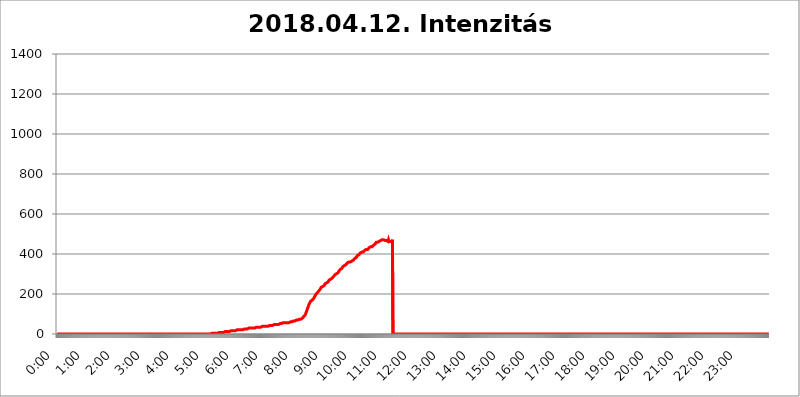
| Category | 2018.04.12. Intenzitás [W/m^2] |
|---|---|
| 0.0 | 0 |
| 0.0006944444444444445 | 0 |
| 0.001388888888888889 | 0 |
| 0.0020833333333333333 | 0 |
| 0.002777777777777778 | 0 |
| 0.003472222222222222 | 0 |
| 0.004166666666666667 | 0 |
| 0.004861111111111111 | 0 |
| 0.005555555555555556 | 0 |
| 0.0062499999999999995 | 0 |
| 0.006944444444444444 | 0 |
| 0.007638888888888889 | 0 |
| 0.008333333333333333 | 0 |
| 0.009027777777777779 | 0 |
| 0.009722222222222222 | 0 |
| 0.010416666666666666 | 0 |
| 0.011111111111111112 | 0 |
| 0.011805555555555555 | 0 |
| 0.012499999999999999 | 0 |
| 0.013194444444444444 | 0 |
| 0.013888888888888888 | 0 |
| 0.014583333333333332 | 0 |
| 0.015277777777777777 | 0 |
| 0.015972222222222224 | 0 |
| 0.016666666666666666 | 0 |
| 0.017361111111111112 | 0 |
| 0.018055555555555557 | 0 |
| 0.01875 | 0 |
| 0.019444444444444445 | 0 |
| 0.02013888888888889 | 0 |
| 0.020833333333333332 | 0 |
| 0.02152777777777778 | 0 |
| 0.022222222222222223 | 0 |
| 0.02291666666666667 | 0 |
| 0.02361111111111111 | 0 |
| 0.024305555555555556 | 0 |
| 0.024999999999999998 | 0 |
| 0.025694444444444447 | 0 |
| 0.02638888888888889 | 0 |
| 0.027083333333333334 | 0 |
| 0.027777777777777776 | 0 |
| 0.02847222222222222 | 0 |
| 0.029166666666666664 | 0 |
| 0.029861111111111113 | 0 |
| 0.030555555555555555 | 0 |
| 0.03125 | 0 |
| 0.03194444444444445 | 0 |
| 0.03263888888888889 | 0 |
| 0.03333333333333333 | 0 |
| 0.034027777777777775 | 0 |
| 0.034722222222222224 | 0 |
| 0.035416666666666666 | 0 |
| 0.036111111111111115 | 0 |
| 0.03680555555555556 | 0 |
| 0.0375 | 0 |
| 0.03819444444444444 | 0 |
| 0.03888888888888889 | 0 |
| 0.03958333333333333 | 0 |
| 0.04027777777777778 | 0 |
| 0.04097222222222222 | 0 |
| 0.041666666666666664 | 0 |
| 0.042361111111111106 | 0 |
| 0.04305555555555556 | 0 |
| 0.043750000000000004 | 0 |
| 0.044444444444444446 | 0 |
| 0.04513888888888889 | 0 |
| 0.04583333333333334 | 0 |
| 0.04652777777777778 | 0 |
| 0.04722222222222222 | 0 |
| 0.04791666666666666 | 0 |
| 0.04861111111111111 | 0 |
| 0.049305555555555554 | 0 |
| 0.049999999999999996 | 0 |
| 0.05069444444444445 | 0 |
| 0.051388888888888894 | 0 |
| 0.052083333333333336 | 0 |
| 0.05277777777777778 | 0 |
| 0.05347222222222222 | 0 |
| 0.05416666666666667 | 0 |
| 0.05486111111111111 | 0 |
| 0.05555555555555555 | 0 |
| 0.05625 | 0 |
| 0.05694444444444444 | 0 |
| 0.057638888888888885 | 0 |
| 0.05833333333333333 | 0 |
| 0.05902777777777778 | 0 |
| 0.059722222222222225 | 0 |
| 0.06041666666666667 | 0 |
| 0.061111111111111116 | 0 |
| 0.06180555555555556 | 0 |
| 0.0625 | 0 |
| 0.06319444444444444 | 0 |
| 0.06388888888888888 | 0 |
| 0.06458333333333334 | 0 |
| 0.06527777777777778 | 0 |
| 0.06597222222222222 | 0 |
| 0.06666666666666667 | 0 |
| 0.06736111111111111 | 0 |
| 0.06805555555555555 | 0 |
| 0.06874999999999999 | 0 |
| 0.06944444444444443 | 0 |
| 0.07013888888888889 | 0 |
| 0.07083333333333333 | 0 |
| 0.07152777777777779 | 0 |
| 0.07222222222222223 | 0 |
| 0.07291666666666667 | 0 |
| 0.07361111111111111 | 0 |
| 0.07430555555555556 | 0 |
| 0.075 | 0 |
| 0.07569444444444444 | 0 |
| 0.0763888888888889 | 0 |
| 0.07708333333333334 | 0 |
| 0.07777777777777778 | 0 |
| 0.07847222222222222 | 0 |
| 0.07916666666666666 | 0 |
| 0.0798611111111111 | 0 |
| 0.08055555555555556 | 0 |
| 0.08125 | 0 |
| 0.08194444444444444 | 0 |
| 0.08263888888888889 | 0 |
| 0.08333333333333333 | 0 |
| 0.08402777777777777 | 0 |
| 0.08472222222222221 | 0 |
| 0.08541666666666665 | 0 |
| 0.08611111111111112 | 0 |
| 0.08680555555555557 | 0 |
| 0.08750000000000001 | 0 |
| 0.08819444444444445 | 0 |
| 0.08888888888888889 | 0 |
| 0.08958333333333333 | 0 |
| 0.09027777777777778 | 0 |
| 0.09097222222222222 | 0 |
| 0.09166666666666667 | 0 |
| 0.09236111111111112 | 0 |
| 0.09305555555555556 | 0 |
| 0.09375 | 0 |
| 0.09444444444444444 | 0 |
| 0.09513888888888888 | 0 |
| 0.09583333333333333 | 0 |
| 0.09652777777777777 | 0 |
| 0.09722222222222222 | 0 |
| 0.09791666666666667 | 0 |
| 0.09861111111111111 | 0 |
| 0.09930555555555555 | 0 |
| 0.09999999999999999 | 0 |
| 0.10069444444444443 | 0 |
| 0.1013888888888889 | 0 |
| 0.10208333333333335 | 0 |
| 0.10277777777777779 | 0 |
| 0.10347222222222223 | 0 |
| 0.10416666666666667 | 0 |
| 0.10486111111111111 | 0 |
| 0.10555555555555556 | 0 |
| 0.10625 | 0 |
| 0.10694444444444444 | 0 |
| 0.1076388888888889 | 0 |
| 0.10833333333333334 | 0 |
| 0.10902777777777778 | 0 |
| 0.10972222222222222 | 0 |
| 0.1111111111111111 | 0 |
| 0.11180555555555556 | 0 |
| 0.11180555555555556 | 0 |
| 0.1125 | 0 |
| 0.11319444444444444 | 0 |
| 0.11388888888888889 | 0 |
| 0.11458333333333333 | 0 |
| 0.11527777777777777 | 0 |
| 0.11597222222222221 | 0 |
| 0.11666666666666665 | 0 |
| 0.1173611111111111 | 0 |
| 0.11805555555555557 | 0 |
| 0.11944444444444445 | 0 |
| 0.12013888888888889 | 0 |
| 0.12083333333333333 | 0 |
| 0.12152777777777778 | 0 |
| 0.12222222222222223 | 0 |
| 0.12291666666666667 | 0 |
| 0.12291666666666667 | 0 |
| 0.12361111111111112 | 0 |
| 0.12430555555555556 | 0 |
| 0.125 | 0 |
| 0.12569444444444444 | 0 |
| 0.12638888888888888 | 0 |
| 0.12708333333333333 | 0 |
| 0.16875 | 0 |
| 0.12847222222222224 | 0 |
| 0.12916666666666668 | 0 |
| 0.12986111111111112 | 0 |
| 0.13055555555555556 | 0 |
| 0.13125 | 0 |
| 0.13194444444444445 | 0 |
| 0.1326388888888889 | 0 |
| 0.13333333333333333 | 0 |
| 0.13402777777777777 | 0 |
| 0.13402777777777777 | 0 |
| 0.13472222222222222 | 0 |
| 0.13541666666666666 | 0 |
| 0.1361111111111111 | 0 |
| 0.13749999999999998 | 0 |
| 0.13819444444444443 | 0 |
| 0.1388888888888889 | 0 |
| 0.13958333333333334 | 0 |
| 0.14027777777777778 | 0 |
| 0.14097222222222222 | 0 |
| 0.14166666666666666 | 0 |
| 0.1423611111111111 | 0 |
| 0.14305555555555557 | 0 |
| 0.14375000000000002 | 0 |
| 0.14444444444444446 | 0 |
| 0.1451388888888889 | 0 |
| 0.1451388888888889 | 0 |
| 0.14652777777777778 | 0 |
| 0.14722222222222223 | 0 |
| 0.14791666666666667 | 0 |
| 0.1486111111111111 | 0 |
| 0.14930555555555555 | 0 |
| 0.15 | 0 |
| 0.15069444444444444 | 0 |
| 0.15138888888888888 | 0 |
| 0.15208333333333332 | 0 |
| 0.15277777777777776 | 0 |
| 0.15347222222222223 | 0 |
| 0.15416666666666667 | 0 |
| 0.15486111111111112 | 0 |
| 0.15555555555555556 | 0 |
| 0.15625 | 0 |
| 0.15694444444444444 | 0 |
| 0.15763888888888888 | 0 |
| 0.15833333333333333 | 0 |
| 0.15902777777777777 | 0 |
| 0.15972222222222224 | 0 |
| 0.16041666666666668 | 0 |
| 0.16111111111111112 | 0 |
| 0.16180555555555556 | 0 |
| 0.1625 | 0 |
| 0.16319444444444445 | 0 |
| 0.1638888888888889 | 0 |
| 0.16458333333333333 | 0 |
| 0.16527777777777777 | 0 |
| 0.16597222222222222 | 0 |
| 0.16666666666666666 | 0 |
| 0.1673611111111111 | 0 |
| 0.16805555555555554 | 0 |
| 0.16874999999999998 | 0 |
| 0.16944444444444443 | 0 |
| 0.17013888888888887 | 0 |
| 0.1708333333333333 | 0 |
| 0.17152777777777775 | 0 |
| 0.17222222222222225 | 0 |
| 0.1729166666666667 | 0 |
| 0.17361111111111113 | 0 |
| 0.17430555555555557 | 0 |
| 0.17500000000000002 | 0 |
| 0.17569444444444446 | 0 |
| 0.1763888888888889 | 0 |
| 0.17708333333333334 | 0 |
| 0.17777777777777778 | 0 |
| 0.17847222222222223 | 0 |
| 0.17916666666666667 | 0 |
| 0.1798611111111111 | 0 |
| 0.18055555555555555 | 0 |
| 0.18125 | 0 |
| 0.18194444444444444 | 0 |
| 0.1826388888888889 | 0 |
| 0.18333333333333335 | 0 |
| 0.1840277777777778 | 0 |
| 0.18472222222222223 | 0 |
| 0.18541666666666667 | 0 |
| 0.18611111111111112 | 0 |
| 0.18680555555555556 | 0 |
| 0.1875 | 0 |
| 0.18819444444444444 | 0 |
| 0.18888888888888888 | 0 |
| 0.18958333333333333 | 0 |
| 0.19027777777777777 | 0 |
| 0.1909722222222222 | 0 |
| 0.19166666666666665 | 0 |
| 0.19236111111111112 | 0 |
| 0.19305555555555554 | 0 |
| 0.19375 | 0 |
| 0.19444444444444445 | 0 |
| 0.1951388888888889 | 0 |
| 0.19583333333333333 | 0 |
| 0.19652777777777777 | 0 |
| 0.19722222222222222 | 0 |
| 0.19791666666666666 | 0 |
| 0.1986111111111111 | 0 |
| 0.19930555555555554 | 0 |
| 0.19999999999999998 | 0 |
| 0.20069444444444443 | 0 |
| 0.20138888888888887 | 0 |
| 0.2020833333333333 | 0 |
| 0.2027777777777778 | 0 |
| 0.2034722222222222 | 0 |
| 0.2041666666666667 | 0 |
| 0.20486111111111113 | 0 |
| 0.20555555555555557 | 0 |
| 0.20625000000000002 | 0 |
| 0.20694444444444446 | 0 |
| 0.2076388888888889 | 0 |
| 0.20833333333333334 | 0 |
| 0.20902777777777778 | 0 |
| 0.20972222222222223 | 0 |
| 0.21041666666666667 | 0 |
| 0.2111111111111111 | 0 |
| 0.21180555555555555 | 0 |
| 0.2125 | 0 |
| 0.21319444444444444 | 0 |
| 0.2138888888888889 | 0 |
| 0.21458333333333335 | 0 |
| 0.2152777777777778 | 0 |
| 0.21597222222222223 | 0 |
| 0.21666666666666667 | 3.525 |
| 0.21736111111111112 | 0 |
| 0.21805555555555556 | 3.525 |
| 0.21875 | 3.525 |
| 0.21944444444444444 | 3.525 |
| 0.22013888888888888 | 3.525 |
| 0.22083333333333333 | 3.525 |
| 0.22152777777777777 | 3.525 |
| 0.2222222222222222 | 3.525 |
| 0.22291666666666665 | 3.525 |
| 0.2236111111111111 | 3.525 |
| 0.22430555555555556 | 3.525 |
| 0.225 | 3.525 |
| 0.22569444444444445 | 3.525 |
| 0.2263888888888889 | 7.887 |
| 0.22708333333333333 | 7.887 |
| 0.22777777777777777 | 7.887 |
| 0.22847222222222222 | 7.887 |
| 0.22916666666666666 | 7.887 |
| 0.2298611111111111 | 7.887 |
| 0.23055555555555554 | 7.887 |
| 0.23124999999999998 | 7.887 |
| 0.23194444444444443 | 7.887 |
| 0.23263888888888887 | 7.887 |
| 0.2333333333333333 | 7.887 |
| 0.2340277777777778 | 7.887 |
| 0.2347222222222222 | 12.257 |
| 0.2354166666666667 | 12.257 |
| 0.23611111111111113 | 12.257 |
| 0.23680555555555557 | 12.257 |
| 0.23750000000000002 | 12.257 |
| 0.23819444444444446 | 12.257 |
| 0.2388888888888889 | 12.257 |
| 0.23958333333333334 | 12.257 |
| 0.24027777777777778 | 12.257 |
| 0.24097222222222223 | 12.257 |
| 0.24166666666666667 | 12.257 |
| 0.2423611111111111 | 12.257 |
| 0.24305555555555555 | 12.257 |
| 0.24375 | 16.636 |
| 0.24444444444444446 | 16.636 |
| 0.24513888888888888 | 16.636 |
| 0.24583333333333335 | 16.636 |
| 0.2465277777777778 | 16.636 |
| 0.24722222222222223 | 16.636 |
| 0.24791666666666667 | 16.636 |
| 0.24861111111111112 | 16.636 |
| 0.24930555555555556 | 16.636 |
| 0.25 | 16.636 |
| 0.25069444444444444 | 21.024 |
| 0.2513888888888889 | 21.024 |
| 0.2520833333333333 | 21.024 |
| 0.25277777777777777 | 21.024 |
| 0.2534722222222222 | 21.024 |
| 0.25416666666666665 | 21.024 |
| 0.2548611111111111 | 21.024 |
| 0.2555555555555556 | 21.024 |
| 0.25625000000000003 | 21.024 |
| 0.2569444444444445 | 21.024 |
| 0.2576388888888889 | 21.024 |
| 0.25833333333333336 | 21.024 |
| 0.2590277777777778 | 21.024 |
| 0.25972222222222224 | 21.024 |
| 0.2604166666666667 | 21.024 |
| 0.2611111111111111 | 25.419 |
| 0.26180555555555557 | 25.419 |
| 0.2625 | 25.419 |
| 0.26319444444444445 | 25.419 |
| 0.2638888888888889 | 25.419 |
| 0.26458333333333334 | 25.419 |
| 0.2652777777777778 | 25.419 |
| 0.2659722222222222 | 25.419 |
| 0.26666666666666666 | 25.419 |
| 0.2673611111111111 | 29.823 |
| 0.26805555555555555 | 25.419 |
| 0.26875 | 29.823 |
| 0.26944444444444443 | 29.823 |
| 0.2701388888888889 | 29.823 |
| 0.2708333333333333 | 29.823 |
| 0.27152777777777776 | 29.823 |
| 0.2722222222222222 | 29.823 |
| 0.27291666666666664 | 29.823 |
| 0.2736111111111111 | 29.823 |
| 0.2743055555555555 | 29.823 |
| 0.27499999999999997 | 29.823 |
| 0.27569444444444446 | 29.823 |
| 0.27638888888888885 | 29.823 |
| 0.27708333333333335 | 29.823 |
| 0.2777777777777778 | 29.823 |
| 0.27847222222222223 | 34.234 |
| 0.2791666666666667 | 34.234 |
| 0.2798611111111111 | 29.823 |
| 0.28055555555555556 | 34.234 |
| 0.28125 | 34.234 |
| 0.28194444444444444 | 34.234 |
| 0.2826388888888889 | 34.234 |
| 0.2833333333333333 | 34.234 |
| 0.28402777777777777 | 34.234 |
| 0.2847222222222222 | 34.234 |
| 0.28541666666666665 | 34.234 |
| 0.28611111111111115 | 34.234 |
| 0.28680555555555554 | 34.234 |
| 0.28750000000000003 | 38.653 |
| 0.2881944444444445 | 38.653 |
| 0.2888888888888889 | 38.653 |
| 0.28958333333333336 | 38.653 |
| 0.2902777777777778 | 38.653 |
| 0.29097222222222224 | 38.653 |
| 0.2916666666666667 | 38.653 |
| 0.2923611111111111 | 38.653 |
| 0.29305555555555557 | 38.653 |
| 0.29375 | 38.653 |
| 0.29444444444444445 | 38.653 |
| 0.2951388888888889 | 38.653 |
| 0.29583333333333334 | 38.653 |
| 0.2965277777777778 | 43.079 |
| 0.2972222222222222 | 43.079 |
| 0.29791666666666666 | 43.079 |
| 0.2986111111111111 | 43.079 |
| 0.29930555555555555 | 43.079 |
| 0.3 | 43.079 |
| 0.30069444444444443 | 43.079 |
| 0.3013888888888889 | 43.079 |
| 0.3020833333333333 | 43.079 |
| 0.30277777777777776 | 47.511 |
| 0.3034722222222222 | 47.511 |
| 0.30416666666666664 | 47.511 |
| 0.3048611111111111 | 47.511 |
| 0.3055555555555555 | 47.511 |
| 0.30624999999999997 | 47.511 |
| 0.3069444444444444 | 47.511 |
| 0.3076388888888889 | 47.511 |
| 0.30833333333333335 | 47.511 |
| 0.3090277777777778 | 47.511 |
| 0.30972222222222223 | 47.511 |
| 0.3104166666666667 | 47.511 |
| 0.3111111111111111 | 51.951 |
| 0.31180555555555556 | 51.951 |
| 0.3125 | 51.951 |
| 0.31319444444444444 | 51.951 |
| 0.3138888888888889 | 51.951 |
| 0.3145833333333333 | 51.951 |
| 0.31527777777777777 | 51.951 |
| 0.3159722222222222 | 51.951 |
| 0.31666666666666665 | 56.398 |
| 0.31736111111111115 | 56.398 |
| 0.31805555555555554 | 56.398 |
| 0.31875000000000003 | 56.398 |
| 0.3194444444444445 | 56.398 |
| 0.3201388888888889 | 56.398 |
| 0.32083333333333336 | 56.398 |
| 0.3215277777777778 | 56.398 |
| 0.32222222222222224 | 56.398 |
| 0.3229166666666667 | 56.398 |
| 0.3236111111111111 | 56.398 |
| 0.32430555555555557 | 60.85 |
| 0.325 | 56.398 |
| 0.32569444444444445 | 60.85 |
| 0.3263888888888889 | 60.85 |
| 0.32708333333333334 | 60.85 |
| 0.3277777777777778 | 60.85 |
| 0.3284722222222222 | 60.85 |
| 0.32916666666666666 | 60.85 |
| 0.3298611111111111 | 65.31 |
| 0.33055555555555555 | 65.31 |
| 0.33125 | 65.31 |
| 0.33194444444444443 | 65.31 |
| 0.3326388888888889 | 65.31 |
| 0.3333333333333333 | 65.31 |
| 0.3340277777777778 | 65.31 |
| 0.3347222222222222 | 65.31 |
| 0.3354166666666667 | 69.775 |
| 0.3361111111111111 | 69.775 |
| 0.3368055555555556 | 69.775 |
| 0.33749999999999997 | 69.775 |
| 0.33819444444444446 | 74.246 |
| 0.33888888888888885 | 74.246 |
| 0.33958333333333335 | 74.246 |
| 0.34027777777777773 | 74.246 |
| 0.34097222222222223 | 74.246 |
| 0.3416666666666666 | 74.246 |
| 0.3423611111111111 | 78.722 |
| 0.3430555555555555 | 78.722 |
| 0.34375 | 78.722 |
| 0.3444444444444445 | 83.205 |
| 0.3451388888888889 | 83.205 |
| 0.3458333333333334 | 87.692 |
| 0.34652777777777777 | 87.692 |
| 0.34722222222222227 | 92.184 |
| 0.34791666666666665 | 96.682 |
| 0.34861111111111115 | 101.184 |
| 0.34930555555555554 | 110.201 |
| 0.35000000000000003 | 114.716 |
| 0.3506944444444444 | 123.758 |
| 0.3513888888888889 | 128.284 |
| 0.3520833333333333 | 137.347 |
| 0.3527777777777778 | 146.423 |
| 0.3534722222222222 | 150.964 |
| 0.3541666666666667 | 155.509 |
| 0.3548611111111111 | 160.056 |
| 0.35555555555555557 | 164.605 |
| 0.35625 | 169.156 |
| 0.35694444444444445 | 169.156 |
| 0.3576388888888889 | 169.156 |
| 0.35833333333333334 | 173.709 |
| 0.3590277777777778 | 173.709 |
| 0.3597222222222222 | 178.264 |
| 0.36041666666666666 | 182.82 |
| 0.3611111111111111 | 187.378 |
| 0.36180555555555555 | 191.937 |
| 0.3625 | 196.497 |
| 0.36319444444444443 | 201.058 |
| 0.3638888888888889 | 201.058 |
| 0.3645833333333333 | 205.62 |
| 0.3652777777777778 | 210.182 |
| 0.3659722222222222 | 210.182 |
| 0.3666666666666667 | 214.746 |
| 0.3673611111111111 | 219.309 |
| 0.3680555555555556 | 219.309 |
| 0.36874999999999997 | 223.873 |
| 0.36944444444444446 | 228.436 |
| 0.37013888888888885 | 233 |
| 0.37083333333333335 | 233 |
| 0.37152777777777773 | 233 |
| 0.37222222222222223 | 237.564 |
| 0.3729166666666666 | 237.564 |
| 0.3736111111111111 | 242.127 |
| 0.3743055555555555 | 242.127 |
| 0.375 | 246.689 |
| 0.3756944444444445 | 251.251 |
| 0.3763888888888889 | 251.251 |
| 0.3770833333333334 | 251.251 |
| 0.37777777777777777 | 255.813 |
| 0.37847222222222227 | 255.813 |
| 0.37916666666666665 | 260.373 |
| 0.37986111111111115 | 260.373 |
| 0.38055555555555554 | 264.932 |
| 0.38125000000000003 | 269.49 |
| 0.3819444444444444 | 269.49 |
| 0.3826388888888889 | 269.49 |
| 0.3833333333333333 | 274.047 |
| 0.3840277777777778 | 274.047 |
| 0.3847222222222222 | 278.603 |
| 0.3854166666666667 | 278.603 |
| 0.3861111111111111 | 283.156 |
| 0.38680555555555557 | 283.156 |
| 0.3875 | 287.709 |
| 0.38819444444444445 | 292.259 |
| 0.3888888888888889 | 292.259 |
| 0.38958333333333334 | 296.808 |
| 0.3902777777777778 | 296.808 |
| 0.3909722222222222 | 301.354 |
| 0.39166666666666666 | 301.354 |
| 0.3923611111111111 | 305.898 |
| 0.39305555555555555 | 305.898 |
| 0.39375 | 305.898 |
| 0.39444444444444443 | 310.44 |
| 0.3951388888888889 | 314.98 |
| 0.3958333333333333 | 314.98 |
| 0.3965277777777778 | 319.517 |
| 0.3972222222222222 | 324.052 |
| 0.3979166666666667 | 324.052 |
| 0.3986111111111111 | 324.052 |
| 0.3993055555555556 | 328.584 |
| 0.39999999999999997 | 333.113 |
| 0.40069444444444446 | 337.639 |
| 0.40138888888888885 | 333.113 |
| 0.40208333333333335 | 337.639 |
| 0.40277777777777773 | 342.162 |
| 0.40347222222222223 | 342.162 |
| 0.4041666666666666 | 346.682 |
| 0.4048611111111111 | 346.682 |
| 0.4055555555555555 | 351.198 |
| 0.40625 | 351.198 |
| 0.4069444444444445 | 355.712 |
| 0.4076388888888889 | 355.712 |
| 0.4083333333333334 | 355.712 |
| 0.40902777777777777 | 360.221 |
| 0.40972222222222227 | 360.221 |
| 0.41041666666666665 | 360.221 |
| 0.41111111111111115 | 360.221 |
| 0.41180555555555554 | 364.728 |
| 0.41250000000000003 | 364.728 |
| 0.4131944444444444 | 364.728 |
| 0.4138888888888889 | 369.23 |
| 0.4145833333333333 | 369.23 |
| 0.4152777777777778 | 369.23 |
| 0.4159722222222222 | 369.23 |
| 0.4166666666666667 | 373.729 |
| 0.4173611111111111 | 378.224 |
| 0.41805555555555557 | 378.224 |
| 0.41875 | 378.224 |
| 0.41944444444444445 | 382.715 |
| 0.4201388888888889 | 387.202 |
| 0.42083333333333334 | 391.685 |
| 0.4215277777777778 | 391.685 |
| 0.4222222222222222 | 396.164 |
| 0.42291666666666666 | 396.164 |
| 0.4236111111111111 | 400.638 |
| 0.42430555555555555 | 400.638 |
| 0.425 | 405.108 |
| 0.42569444444444443 | 405.108 |
| 0.4263888888888889 | 405.108 |
| 0.4270833333333333 | 409.574 |
| 0.4277777777777778 | 409.574 |
| 0.4284722222222222 | 409.574 |
| 0.4291666666666667 | 409.574 |
| 0.4298611111111111 | 414.035 |
| 0.4305555555555556 | 414.035 |
| 0.43124999999999997 | 418.492 |
| 0.43194444444444446 | 418.492 |
| 0.43263888888888885 | 422.943 |
| 0.43333333333333335 | 422.943 |
| 0.43402777777777773 | 422.943 |
| 0.43472222222222223 | 422.943 |
| 0.4354166666666666 | 422.943 |
| 0.4361111111111111 | 427.39 |
| 0.4368055555555555 | 427.39 |
| 0.4375 | 431.833 |
| 0.4381944444444445 | 431.833 |
| 0.4388888888888889 | 431.833 |
| 0.4395833333333334 | 436.27 |
| 0.44027777777777777 | 436.27 |
| 0.44097222222222227 | 436.27 |
| 0.44166666666666665 | 436.27 |
| 0.44236111111111115 | 440.702 |
| 0.44305555555555554 | 440.702 |
| 0.44375000000000003 | 445.129 |
| 0.4444444444444444 | 445.129 |
| 0.4451388888888889 | 449.551 |
| 0.4458333333333333 | 449.551 |
| 0.4465277777777778 | 453.968 |
| 0.4472222222222222 | 458.38 |
| 0.4479166666666667 | 458.38 |
| 0.4486111111111111 | 458.38 |
| 0.44930555555555557 | 458.38 |
| 0.45 | 462.786 |
| 0.45069444444444445 | 462.786 |
| 0.4513888888888889 | 462.786 |
| 0.45208333333333334 | 462.786 |
| 0.4527777777777778 | 467.187 |
| 0.4534722222222222 | 467.187 |
| 0.45416666666666666 | 467.187 |
| 0.4548611111111111 | 471.582 |
| 0.45555555555555555 | 471.582 |
| 0.45625 | 467.187 |
| 0.45694444444444443 | 467.187 |
| 0.4576388888888889 | 471.582 |
| 0.4583333333333333 | 471.582 |
| 0.4590277777777778 | 471.582 |
| 0.4597222222222222 | 467.187 |
| 0.4604166666666667 | 471.582 |
| 0.4611111111111111 | 471.582 |
| 0.4618055555555556 | 467.187 |
| 0.46249999999999997 | 467.187 |
| 0.46319444444444446 | 467.187 |
| 0.46388888888888885 | 462.786 |
| 0.46458333333333335 | 471.582 |
| 0.46527777777777773 | 462.786 |
| 0.46597222222222223 | 462.786 |
| 0.4666666666666666 | 462.786 |
| 0.4673611111111111 | 462.786 |
| 0.4680555555555555 | 462.786 |
| 0.46875 | 467.187 |
| 0.4694444444444445 | 462.786 |
| 0.4701388888888889 | 471.582 |
| 0.4708333333333334 | 0 |
| 0.47152777777777777 | 0 |
| 0.47222222222222227 | 0 |
| 0.47291666666666665 | 0 |
| 0.47361111111111115 | 0 |
| 0.47430555555555554 | 0 |
| 0.47500000000000003 | 0 |
| 0.4756944444444444 | 0 |
| 0.4763888888888889 | 0 |
| 0.4770833333333333 | 0 |
| 0.4777777777777778 | 0 |
| 0.4784722222222222 | 0 |
| 0.4791666666666667 | 0 |
| 0.4798611111111111 | 0 |
| 0.48055555555555557 | 0 |
| 0.48125 | 0 |
| 0.48194444444444445 | 0 |
| 0.4826388888888889 | 0 |
| 0.48333333333333334 | 0 |
| 0.4840277777777778 | 0 |
| 0.4847222222222222 | 0 |
| 0.48541666666666666 | 0 |
| 0.4861111111111111 | 0 |
| 0.48680555555555555 | 0 |
| 0.4875 | 0 |
| 0.48819444444444443 | 0 |
| 0.4888888888888889 | 0 |
| 0.4895833333333333 | 0 |
| 0.4902777777777778 | 0 |
| 0.4909722222222222 | 0 |
| 0.4916666666666667 | 0 |
| 0.4923611111111111 | 0 |
| 0.4930555555555556 | 0 |
| 0.49374999999999997 | 0 |
| 0.49444444444444446 | 0 |
| 0.49513888888888885 | 0 |
| 0.49583333333333335 | 0 |
| 0.49652777777777773 | 0 |
| 0.49722222222222223 | 0 |
| 0.4979166666666666 | 0 |
| 0.4986111111111111 | 0 |
| 0.4993055555555555 | 0 |
| 0.5 | 0 |
| 0.5006944444444444 | 0 |
| 0.5013888888888889 | 0 |
| 0.5020833333333333 | 0 |
| 0.5027777777777778 | 0 |
| 0.5034722222222222 | 0 |
| 0.5041666666666667 | 0 |
| 0.5048611111111111 | 0 |
| 0.5055555555555555 | 0 |
| 0.50625 | 0 |
| 0.5069444444444444 | 0 |
| 0.5076388888888889 | 0 |
| 0.5083333333333333 | 0 |
| 0.5090277777777777 | 0 |
| 0.5097222222222222 | 0 |
| 0.5104166666666666 | 0 |
| 0.5111111111111112 | 0 |
| 0.5118055555555555 | 0 |
| 0.5125000000000001 | 0 |
| 0.5131944444444444 | 0 |
| 0.513888888888889 | 0 |
| 0.5145833333333333 | 0 |
| 0.5152777777777778 | 0 |
| 0.5159722222222222 | 0 |
| 0.5166666666666667 | 0 |
| 0.517361111111111 | 0 |
| 0.5180555555555556 | 0 |
| 0.5187499999999999 | 0 |
| 0.5194444444444445 | 0 |
| 0.5201388888888888 | 0 |
| 0.5208333333333334 | 0 |
| 0.5215277777777778 | 0 |
| 0.5222222222222223 | 0 |
| 0.5229166666666667 | 0 |
| 0.5236111111111111 | 0 |
| 0.5243055555555556 | 0 |
| 0.525 | 0 |
| 0.5256944444444445 | 0 |
| 0.5263888888888889 | 0 |
| 0.5270833333333333 | 0 |
| 0.5277777777777778 | 0 |
| 0.5284722222222222 | 0 |
| 0.5291666666666667 | 0 |
| 0.5298611111111111 | 0 |
| 0.5305555555555556 | 0 |
| 0.53125 | 0 |
| 0.5319444444444444 | 0 |
| 0.5326388888888889 | 0 |
| 0.5333333333333333 | 0 |
| 0.5340277777777778 | 0 |
| 0.5347222222222222 | 0 |
| 0.5354166666666667 | 0 |
| 0.5361111111111111 | 0 |
| 0.5368055555555555 | 0 |
| 0.5375 | 0 |
| 0.5381944444444444 | 0 |
| 0.5388888888888889 | 0 |
| 0.5395833333333333 | 0 |
| 0.5402777777777777 | 0 |
| 0.5409722222222222 | 0 |
| 0.5416666666666666 | 0 |
| 0.5423611111111112 | 0 |
| 0.5430555555555555 | 0 |
| 0.5437500000000001 | 0 |
| 0.5444444444444444 | 0 |
| 0.545138888888889 | 0 |
| 0.5458333333333333 | 0 |
| 0.5465277777777778 | 0 |
| 0.5472222222222222 | 0 |
| 0.5479166666666667 | 0 |
| 0.548611111111111 | 0 |
| 0.5493055555555556 | 0 |
| 0.5499999999999999 | 0 |
| 0.5506944444444445 | 0 |
| 0.5513888888888888 | 0 |
| 0.5520833333333334 | 0 |
| 0.5527777777777778 | 0 |
| 0.5534722222222223 | 0 |
| 0.5541666666666667 | 0 |
| 0.5548611111111111 | 0 |
| 0.5555555555555556 | 0 |
| 0.55625 | 0 |
| 0.5569444444444445 | 0 |
| 0.5576388888888889 | 0 |
| 0.5583333333333333 | 0 |
| 0.5590277777777778 | 0 |
| 0.5597222222222222 | 0 |
| 0.5604166666666667 | 0 |
| 0.5611111111111111 | 0 |
| 0.5618055555555556 | 0 |
| 0.5625 | 0 |
| 0.5631944444444444 | 0 |
| 0.5638888888888889 | 0 |
| 0.5645833333333333 | 0 |
| 0.5652777777777778 | 0 |
| 0.5659722222222222 | 0 |
| 0.5666666666666667 | 0 |
| 0.5673611111111111 | 0 |
| 0.5680555555555555 | 0 |
| 0.56875 | 0 |
| 0.5694444444444444 | 0 |
| 0.5701388888888889 | 0 |
| 0.5708333333333333 | 0 |
| 0.5715277777777777 | 0 |
| 0.5722222222222222 | 0 |
| 0.5729166666666666 | 0 |
| 0.5736111111111112 | 0 |
| 0.5743055555555555 | 0 |
| 0.5750000000000001 | 0 |
| 0.5756944444444444 | 0 |
| 0.576388888888889 | 0 |
| 0.5770833333333333 | 0 |
| 0.5777777777777778 | 0 |
| 0.5784722222222222 | 0 |
| 0.5791666666666667 | 0 |
| 0.579861111111111 | 0 |
| 0.5805555555555556 | 0 |
| 0.5812499999999999 | 0 |
| 0.5819444444444445 | 0 |
| 0.5826388888888888 | 0 |
| 0.5833333333333334 | 0 |
| 0.5840277777777778 | 0 |
| 0.5847222222222223 | 0 |
| 0.5854166666666667 | 0 |
| 0.5861111111111111 | 0 |
| 0.5868055555555556 | 0 |
| 0.5875 | 0 |
| 0.5881944444444445 | 0 |
| 0.5888888888888889 | 0 |
| 0.5895833333333333 | 0 |
| 0.5902777777777778 | 0 |
| 0.5909722222222222 | 0 |
| 0.5916666666666667 | 0 |
| 0.5923611111111111 | 0 |
| 0.5930555555555556 | 0 |
| 0.59375 | 0 |
| 0.5944444444444444 | 0 |
| 0.5951388888888889 | 0 |
| 0.5958333333333333 | 0 |
| 0.5965277777777778 | 0 |
| 0.5972222222222222 | 0 |
| 0.5979166666666667 | 0 |
| 0.5986111111111111 | 0 |
| 0.5993055555555555 | 0 |
| 0.6 | 0 |
| 0.6006944444444444 | 0 |
| 0.6013888888888889 | 0 |
| 0.6020833333333333 | 0 |
| 0.6027777777777777 | 0 |
| 0.6034722222222222 | 0 |
| 0.6041666666666666 | 0 |
| 0.6048611111111112 | 0 |
| 0.6055555555555555 | 0 |
| 0.6062500000000001 | 0 |
| 0.6069444444444444 | 0 |
| 0.607638888888889 | 0 |
| 0.6083333333333333 | 0 |
| 0.6090277777777778 | 0 |
| 0.6097222222222222 | 0 |
| 0.6104166666666667 | 0 |
| 0.611111111111111 | 0 |
| 0.6118055555555556 | 0 |
| 0.6124999999999999 | 0 |
| 0.6131944444444445 | 0 |
| 0.6138888888888888 | 0 |
| 0.6145833333333334 | 0 |
| 0.6152777777777778 | 0 |
| 0.6159722222222223 | 0 |
| 0.6166666666666667 | 0 |
| 0.6173611111111111 | 0 |
| 0.6180555555555556 | 0 |
| 0.61875 | 0 |
| 0.6194444444444445 | 0 |
| 0.6201388888888889 | 0 |
| 0.6208333333333333 | 0 |
| 0.6215277777777778 | 0 |
| 0.6222222222222222 | 0 |
| 0.6229166666666667 | 0 |
| 0.6236111111111111 | 0 |
| 0.6243055555555556 | 0 |
| 0.625 | 0 |
| 0.6256944444444444 | 0 |
| 0.6263888888888889 | 0 |
| 0.6270833333333333 | 0 |
| 0.6277777777777778 | 0 |
| 0.6284722222222222 | 0 |
| 0.6291666666666667 | 0 |
| 0.6298611111111111 | 0 |
| 0.6305555555555555 | 0 |
| 0.63125 | 0 |
| 0.6319444444444444 | 0 |
| 0.6326388888888889 | 0 |
| 0.6333333333333333 | 0 |
| 0.6340277777777777 | 0 |
| 0.6347222222222222 | 0 |
| 0.6354166666666666 | 0 |
| 0.6361111111111112 | 0 |
| 0.6368055555555555 | 0 |
| 0.6375000000000001 | 0 |
| 0.6381944444444444 | 0 |
| 0.638888888888889 | 0 |
| 0.6395833333333333 | 0 |
| 0.6402777777777778 | 0 |
| 0.6409722222222222 | 0 |
| 0.6416666666666667 | 0 |
| 0.642361111111111 | 0 |
| 0.6430555555555556 | 0 |
| 0.6437499999999999 | 0 |
| 0.6444444444444445 | 0 |
| 0.6451388888888888 | 0 |
| 0.6458333333333334 | 0 |
| 0.6465277777777778 | 0 |
| 0.6472222222222223 | 0 |
| 0.6479166666666667 | 0 |
| 0.6486111111111111 | 0 |
| 0.6493055555555556 | 0 |
| 0.65 | 0 |
| 0.6506944444444445 | 0 |
| 0.6513888888888889 | 0 |
| 0.6520833333333333 | 0 |
| 0.6527777777777778 | 0 |
| 0.6534722222222222 | 0 |
| 0.6541666666666667 | 0 |
| 0.6548611111111111 | 0 |
| 0.6555555555555556 | 0 |
| 0.65625 | 0 |
| 0.6569444444444444 | 0 |
| 0.6576388888888889 | 0 |
| 0.6583333333333333 | 0 |
| 0.6590277777777778 | 0 |
| 0.6597222222222222 | 0 |
| 0.6604166666666667 | 0 |
| 0.6611111111111111 | 0 |
| 0.6618055555555555 | 0 |
| 0.6625 | 0 |
| 0.6631944444444444 | 0 |
| 0.6638888888888889 | 0 |
| 0.6645833333333333 | 0 |
| 0.6652777777777777 | 0 |
| 0.6659722222222222 | 0 |
| 0.6666666666666666 | 0 |
| 0.6673611111111111 | 0 |
| 0.6680555555555556 | 0 |
| 0.6687500000000001 | 0 |
| 0.6694444444444444 | 0 |
| 0.6701388888888888 | 0 |
| 0.6708333333333334 | 0 |
| 0.6715277777777778 | 0 |
| 0.6722222222222222 | 0 |
| 0.6729166666666666 | 0 |
| 0.6736111111111112 | 0 |
| 0.6743055555555556 | 0 |
| 0.6749999999999999 | 0 |
| 0.6756944444444444 | 0 |
| 0.6763888888888889 | 0 |
| 0.6770833333333334 | 0 |
| 0.6777777777777777 | 0 |
| 0.6784722222222223 | 0 |
| 0.6791666666666667 | 0 |
| 0.6798611111111111 | 0 |
| 0.6805555555555555 | 0 |
| 0.68125 | 0 |
| 0.6819444444444445 | 0 |
| 0.6826388888888889 | 0 |
| 0.6833333333333332 | 0 |
| 0.6840277777777778 | 0 |
| 0.6847222222222222 | 0 |
| 0.6854166666666667 | 0 |
| 0.686111111111111 | 0 |
| 0.6868055555555556 | 0 |
| 0.6875 | 0 |
| 0.6881944444444444 | 0 |
| 0.688888888888889 | 0 |
| 0.6895833333333333 | 0 |
| 0.6902777777777778 | 0 |
| 0.6909722222222222 | 0 |
| 0.6916666666666668 | 0 |
| 0.6923611111111111 | 0 |
| 0.6930555555555555 | 0 |
| 0.69375 | 0 |
| 0.6944444444444445 | 0 |
| 0.6951388888888889 | 0 |
| 0.6958333333333333 | 0 |
| 0.6965277777777777 | 0 |
| 0.6972222222222223 | 0 |
| 0.6979166666666666 | 0 |
| 0.6986111111111111 | 0 |
| 0.6993055555555556 | 0 |
| 0.7000000000000001 | 0 |
| 0.7006944444444444 | 0 |
| 0.7013888888888888 | 0 |
| 0.7020833333333334 | 0 |
| 0.7027777777777778 | 0 |
| 0.7034722222222222 | 0 |
| 0.7041666666666666 | 0 |
| 0.7048611111111112 | 0 |
| 0.7055555555555556 | 0 |
| 0.7062499999999999 | 0 |
| 0.7069444444444444 | 0 |
| 0.7076388888888889 | 0 |
| 0.7083333333333334 | 0 |
| 0.7090277777777777 | 0 |
| 0.7097222222222223 | 0 |
| 0.7104166666666667 | 0 |
| 0.7111111111111111 | 0 |
| 0.7118055555555555 | 0 |
| 0.7125 | 0 |
| 0.7131944444444445 | 0 |
| 0.7138888888888889 | 0 |
| 0.7145833333333332 | 0 |
| 0.7152777777777778 | 0 |
| 0.7159722222222222 | 0 |
| 0.7166666666666667 | 0 |
| 0.717361111111111 | 0 |
| 0.7180555555555556 | 0 |
| 0.71875 | 0 |
| 0.7194444444444444 | 0 |
| 0.720138888888889 | 0 |
| 0.7208333333333333 | 0 |
| 0.7215277777777778 | 0 |
| 0.7222222222222222 | 0 |
| 0.7229166666666668 | 0 |
| 0.7236111111111111 | 0 |
| 0.7243055555555555 | 0 |
| 0.725 | 0 |
| 0.7256944444444445 | 0 |
| 0.7263888888888889 | 0 |
| 0.7270833333333333 | 0 |
| 0.7277777777777777 | 0 |
| 0.7284722222222223 | 0 |
| 0.7291666666666666 | 0 |
| 0.7298611111111111 | 0 |
| 0.7305555555555556 | 0 |
| 0.7312500000000001 | 0 |
| 0.7319444444444444 | 0 |
| 0.7326388888888888 | 0 |
| 0.7333333333333334 | 0 |
| 0.7340277777777778 | 0 |
| 0.7347222222222222 | 0 |
| 0.7354166666666666 | 0 |
| 0.7361111111111112 | 0 |
| 0.7368055555555556 | 0 |
| 0.7374999999999999 | 0 |
| 0.7381944444444444 | 0 |
| 0.7388888888888889 | 0 |
| 0.7395833333333334 | 0 |
| 0.7402777777777777 | 0 |
| 0.7409722222222223 | 0 |
| 0.7416666666666667 | 0 |
| 0.7423611111111111 | 0 |
| 0.7430555555555555 | 0 |
| 0.74375 | 0 |
| 0.7444444444444445 | 0 |
| 0.7451388888888889 | 0 |
| 0.7458333333333332 | 0 |
| 0.7465277777777778 | 0 |
| 0.7472222222222222 | 0 |
| 0.7479166666666667 | 0 |
| 0.748611111111111 | 0 |
| 0.7493055555555556 | 0 |
| 0.75 | 0 |
| 0.7506944444444444 | 0 |
| 0.751388888888889 | 0 |
| 0.7520833333333333 | 0 |
| 0.7527777777777778 | 0 |
| 0.7534722222222222 | 0 |
| 0.7541666666666668 | 0 |
| 0.7548611111111111 | 0 |
| 0.7555555555555555 | 0 |
| 0.75625 | 0 |
| 0.7569444444444445 | 0 |
| 0.7576388888888889 | 0 |
| 0.7583333333333333 | 0 |
| 0.7590277777777777 | 0 |
| 0.7597222222222223 | 0 |
| 0.7604166666666666 | 0 |
| 0.7611111111111111 | 0 |
| 0.7618055555555556 | 0 |
| 0.7625000000000001 | 0 |
| 0.7631944444444444 | 0 |
| 0.7638888888888888 | 0 |
| 0.7645833333333334 | 0 |
| 0.7652777777777778 | 0 |
| 0.7659722222222222 | 0 |
| 0.7666666666666666 | 0 |
| 0.7673611111111112 | 0 |
| 0.7680555555555556 | 0 |
| 0.7687499999999999 | 0 |
| 0.7694444444444444 | 0 |
| 0.7701388888888889 | 0 |
| 0.7708333333333334 | 0 |
| 0.7715277777777777 | 0 |
| 0.7722222222222223 | 0 |
| 0.7729166666666667 | 0 |
| 0.7736111111111111 | 0 |
| 0.7743055555555555 | 0 |
| 0.775 | 0 |
| 0.7756944444444445 | 0 |
| 0.7763888888888889 | 0 |
| 0.7770833333333332 | 0 |
| 0.7777777777777778 | 0 |
| 0.7784722222222222 | 0 |
| 0.7791666666666667 | 0 |
| 0.779861111111111 | 0 |
| 0.7805555555555556 | 0 |
| 0.78125 | 0 |
| 0.7819444444444444 | 0 |
| 0.782638888888889 | 0 |
| 0.7833333333333333 | 0 |
| 0.7840277777777778 | 0 |
| 0.7847222222222222 | 0 |
| 0.7854166666666668 | 0 |
| 0.7861111111111111 | 0 |
| 0.7868055555555555 | 0 |
| 0.7875 | 0 |
| 0.7881944444444445 | 0 |
| 0.7888888888888889 | 0 |
| 0.7895833333333333 | 0 |
| 0.7902777777777777 | 0 |
| 0.7909722222222223 | 0 |
| 0.7916666666666666 | 0 |
| 0.7923611111111111 | 0 |
| 0.7930555555555556 | 0 |
| 0.7937500000000001 | 0 |
| 0.7944444444444444 | 0 |
| 0.7951388888888888 | 0 |
| 0.7958333333333334 | 0 |
| 0.7965277777777778 | 0 |
| 0.7972222222222222 | 0 |
| 0.7979166666666666 | 0 |
| 0.7986111111111112 | 0 |
| 0.7993055555555556 | 0 |
| 0.7999999999999999 | 0 |
| 0.8006944444444444 | 0 |
| 0.8013888888888889 | 0 |
| 0.8020833333333334 | 0 |
| 0.8027777777777777 | 0 |
| 0.8034722222222223 | 0 |
| 0.8041666666666667 | 0 |
| 0.8048611111111111 | 0 |
| 0.8055555555555555 | 0 |
| 0.80625 | 0 |
| 0.8069444444444445 | 0 |
| 0.8076388888888889 | 0 |
| 0.8083333333333332 | 0 |
| 0.8090277777777778 | 0 |
| 0.8097222222222222 | 0 |
| 0.8104166666666667 | 0 |
| 0.811111111111111 | 0 |
| 0.8118055555555556 | 0 |
| 0.8125 | 0 |
| 0.8131944444444444 | 0 |
| 0.813888888888889 | 0 |
| 0.8145833333333333 | 0 |
| 0.8152777777777778 | 0 |
| 0.8159722222222222 | 0 |
| 0.8166666666666668 | 0 |
| 0.8173611111111111 | 0 |
| 0.8180555555555555 | 0 |
| 0.81875 | 0 |
| 0.8194444444444445 | 0 |
| 0.8201388888888889 | 0 |
| 0.8208333333333333 | 0 |
| 0.8215277777777777 | 0 |
| 0.8222222222222223 | 0 |
| 0.8229166666666666 | 0 |
| 0.8236111111111111 | 0 |
| 0.8243055555555556 | 0 |
| 0.8250000000000001 | 0 |
| 0.8256944444444444 | 0 |
| 0.8263888888888888 | 0 |
| 0.8270833333333334 | 0 |
| 0.8277777777777778 | 0 |
| 0.8284722222222222 | 0 |
| 0.8291666666666666 | 0 |
| 0.8298611111111112 | 0 |
| 0.8305555555555556 | 0 |
| 0.8312499999999999 | 0 |
| 0.8319444444444444 | 0 |
| 0.8326388888888889 | 0 |
| 0.8333333333333334 | 0 |
| 0.8340277777777777 | 0 |
| 0.8347222222222223 | 0 |
| 0.8354166666666667 | 0 |
| 0.8361111111111111 | 0 |
| 0.8368055555555555 | 0 |
| 0.8375 | 0 |
| 0.8381944444444445 | 0 |
| 0.8388888888888889 | 0 |
| 0.8395833333333332 | 0 |
| 0.8402777777777778 | 0 |
| 0.8409722222222222 | 0 |
| 0.8416666666666667 | 0 |
| 0.842361111111111 | 0 |
| 0.8430555555555556 | 0 |
| 0.84375 | 0 |
| 0.8444444444444444 | 0 |
| 0.845138888888889 | 0 |
| 0.8458333333333333 | 0 |
| 0.8465277777777778 | 0 |
| 0.8472222222222222 | 0 |
| 0.8479166666666668 | 0 |
| 0.8486111111111111 | 0 |
| 0.8493055555555555 | 0 |
| 0.85 | 0 |
| 0.8506944444444445 | 0 |
| 0.8513888888888889 | 0 |
| 0.8520833333333333 | 0 |
| 0.8527777777777777 | 0 |
| 0.8534722222222223 | 0 |
| 0.8541666666666666 | 0 |
| 0.8548611111111111 | 0 |
| 0.8555555555555556 | 0 |
| 0.8562500000000001 | 0 |
| 0.8569444444444444 | 0 |
| 0.8576388888888888 | 0 |
| 0.8583333333333334 | 0 |
| 0.8590277777777778 | 0 |
| 0.8597222222222222 | 0 |
| 0.8604166666666666 | 0 |
| 0.8611111111111112 | 0 |
| 0.8618055555555556 | 0 |
| 0.8624999999999999 | 0 |
| 0.8631944444444444 | 0 |
| 0.8638888888888889 | 0 |
| 0.8645833333333334 | 0 |
| 0.8652777777777777 | 0 |
| 0.8659722222222223 | 0 |
| 0.8666666666666667 | 0 |
| 0.8673611111111111 | 0 |
| 0.8680555555555555 | 0 |
| 0.86875 | 0 |
| 0.8694444444444445 | 0 |
| 0.8701388888888889 | 0 |
| 0.8708333333333332 | 0 |
| 0.8715277777777778 | 0 |
| 0.8722222222222222 | 0 |
| 0.8729166666666667 | 0 |
| 0.873611111111111 | 0 |
| 0.8743055555555556 | 0 |
| 0.875 | 0 |
| 0.8756944444444444 | 0 |
| 0.876388888888889 | 0 |
| 0.8770833333333333 | 0 |
| 0.8777777777777778 | 0 |
| 0.8784722222222222 | 0 |
| 0.8791666666666668 | 0 |
| 0.8798611111111111 | 0 |
| 0.8805555555555555 | 0 |
| 0.88125 | 0 |
| 0.8819444444444445 | 0 |
| 0.8826388888888889 | 0 |
| 0.8833333333333333 | 0 |
| 0.8840277777777777 | 0 |
| 0.8847222222222223 | 0 |
| 0.8854166666666666 | 0 |
| 0.8861111111111111 | 0 |
| 0.8868055555555556 | 0 |
| 0.8875000000000001 | 0 |
| 0.8881944444444444 | 0 |
| 0.8888888888888888 | 0 |
| 0.8895833333333334 | 0 |
| 0.8902777777777778 | 0 |
| 0.8909722222222222 | 0 |
| 0.8916666666666666 | 0 |
| 0.8923611111111112 | 0 |
| 0.8930555555555556 | 0 |
| 0.8937499999999999 | 0 |
| 0.8944444444444444 | 0 |
| 0.8951388888888889 | 0 |
| 0.8958333333333334 | 0 |
| 0.8965277777777777 | 0 |
| 0.8972222222222223 | 0 |
| 0.8979166666666667 | 0 |
| 0.8986111111111111 | 0 |
| 0.8993055555555555 | 0 |
| 0.9 | 0 |
| 0.9006944444444445 | 0 |
| 0.9013888888888889 | 0 |
| 0.9020833333333332 | 0 |
| 0.9027777777777778 | 0 |
| 0.9034722222222222 | 0 |
| 0.9041666666666667 | 0 |
| 0.904861111111111 | 0 |
| 0.9055555555555556 | 0 |
| 0.90625 | 0 |
| 0.9069444444444444 | 0 |
| 0.907638888888889 | 0 |
| 0.9083333333333333 | 0 |
| 0.9090277777777778 | 0 |
| 0.9097222222222222 | 0 |
| 0.9104166666666668 | 0 |
| 0.9111111111111111 | 0 |
| 0.9118055555555555 | 0 |
| 0.9125 | 0 |
| 0.9131944444444445 | 0 |
| 0.9138888888888889 | 0 |
| 0.9145833333333333 | 0 |
| 0.9152777777777777 | 0 |
| 0.9159722222222223 | 0 |
| 0.9166666666666666 | 0 |
| 0.9173611111111111 | 0 |
| 0.9180555555555556 | 0 |
| 0.9187500000000001 | 0 |
| 0.9194444444444444 | 0 |
| 0.9201388888888888 | 0 |
| 0.9208333333333334 | 0 |
| 0.9215277777777778 | 0 |
| 0.9222222222222222 | 0 |
| 0.9229166666666666 | 0 |
| 0.9236111111111112 | 0 |
| 0.9243055555555556 | 0 |
| 0.9249999999999999 | 0 |
| 0.9256944444444444 | 0 |
| 0.9263888888888889 | 0 |
| 0.9270833333333334 | 0 |
| 0.9277777777777777 | 0 |
| 0.9284722222222223 | 0 |
| 0.9291666666666667 | 0 |
| 0.9298611111111111 | 0 |
| 0.9305555555555555 | 0 |
| 0.93125 | 0 |
| 0.9319444444444445 | 0 |
| 0.9326388888888889 | 0 |
| 0.9333333333333332 | 0 |
| 0.9340277777777778 | 0 |
| 0.9347222222222222 | 0 |
| 0.9354166666666667 | 0 |
| 0.936111111111111 | 0 |
| 0.9368055555555556 | 0 |
| 0.9375 | 0 |
| 0.9381944444444444 | 0 |
| 0.938888888888889 | 0 |
| 0.9395833333333333 | 0 |
| 0.9402777777777778 | 0 |
| 0.9409722222222222 | 0 |
| 0.9416666666666668 | 0 |
| 0.9423611111111111 | 0 |
| 0.9430555555555555 | 0 |
| 0.94375 | 0 |
| 0.9444444444444445 | 0 |
| 0.9451388888888889 | 0 |
| 0.9458333333333333 | 0 |
| 0.9465277777777777 | 0 |
| 0.9472222222222223 | 0 |
| 0.9479166666666666 | 0 |
| 0.9486111111111111 | 0 |
| 0.9493055555555556 | 0 |
| 0.9500000000000001 | 0 |
| 0.9506944444444444 | 0 |
| 0.9513888888888888 | 0 |
| 0.9520833333333334 | 0 |
| 0.9527777777777778 | 0 |
| 0.9534722222222222 | 0 |
| 0.9541666666666666 | 0 |
| 0.9548611111111112 | 0 |
| 0.9555555555555556 | 0 |
| 0.9562499999999999 | 0 |
| 0.9569444444444444 | 0 |
| 0.9576388888888889 | 0 |
| 0.9583333333333334 | 0 |
| 0.9590277777777777 | 0 |
| 0.9597222222222223 | 0 |
| 0.9604166666666667 | 0 |
| 0.9611111111111111 | 0 |
| 0.9618055555555555 | 0 |
| 0.9625 | 0 |
| 0.9631944444444445 | 0 |
| 0.9638888888888889 | 0 |
| 0.9645833333333332 | 0 |
| 0.9652777777777778 | 0 |
| 0.9659722222222222 | 0 |
| 0.9666666666666667 | 0 |
| 0.967361111111111 | 0 |
| 0.9680555555555556 | 0 |
| 0.96875 | 0 |
| 0.9694444444444444 | 0 |
| 0.970138888888889 | 0 |
| 0.9708333333333333 | 0 |
| 0.9715277777777778 | 0 |
| 0.9722222222222222 | 0 |
| 0.9729166666666668 | 0 |
| 0.9736111111111111 | 0 |
| 0.9743055555555555 | 0 |
| 0.975 | 0 |
| 0.9756944444444445 | 0 |
| 0.9763888888888889 | 0 |
| 0.9770833333333333 | 0 |
| 0.9777777777777777 | 0 |
| 0.9784722222222223 | 0 |
| 0.9791666666666666 | 0 |
| 0.9798611111111111 | 0 |
| 0.9805555555555556 | 0 |
| 0.9812500000000001 | 0 |
| 0.9819444444444444 | 0 |
| 0.9826388888888888 | 0 |
| 0.9833333333333334 | 0 |
| 0.9840277777777778 | 0 |
| 0.9847222222222222 | 0 |
| 0.9854166666666666 | 0 |
| 0.9861111111111112 | 0 |
| 0.9868055555555556 | 0 |
| 0.9874999999999999 | 0 |
| 0.9881944444444444 | 0 |
| 0.9888888888888889 | 0 |
| 0.9895833333333334 | 0 |
| 0.9902777777777777 | 0 |
| 0.9909722222222223 | 0 |
| 0.9916666666666667 | 0 |
| 0.9923611111111111 | 0 |
| 0.9930555555555555 | 0 |
| 0.99375 | 0 |
| 0.9944444444444445 | 0 |
| 0.9951388888888889 | 0 |
| 0.9958333333333332 | 0 |
| 0.9965277777777778 | 0 |
| 0.9972222222222222 | 0 |
| 0.9979166666666667 | 0 |
| 0.998611111111111 | 0 |
| 0.9993055555555556 | 0 |